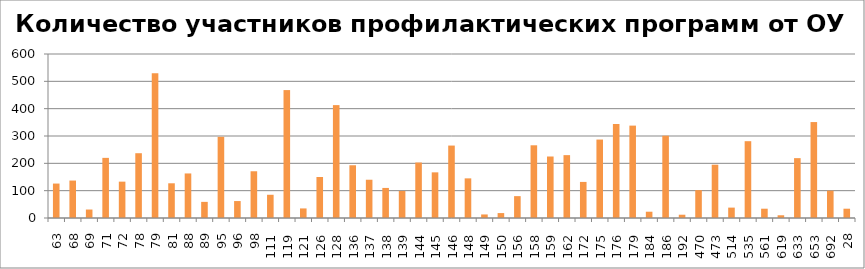
| Category | Количество участников профилактических программ от ОУ |
|---|---|
| 63.0 | 126 |
| 68.0 | 137 |
| 69.0 | 31 |
| 71.0 | 220 |
| 72.0 | 133 |
| 78.0 | 237 |
| 79.0 | 530 |
| 81.0 | 127 |
| 88.0 | 163 |
| 89.0 | 59 |
| 95.0 | 297 |
| 96.0 | 62 |
| 98.0 | 171 |
| 111.0 | 85 |
| 119.0 | 468 |
| 121.0 | 35 |
| 126.0 | 150 |
| 128.0 | 413 |
| 136.0 | 193 |
| 137.0 | 140 |
| 138.0 | 110 |
| 139.0 | 99 |
| 144.0 | 203 |
| 145.0 | 167 |
| 146.0 | 265 |
| 148.0 | 145 |
| 149.0 | 13 |
| 150.0 | 18 |
| 156.0 | 80 |
| 158.0 | 266 |
| 159.0 | 225 |
| 162.0 | 230 |
| 172.0 | 132 |
| 175.0 | 287 |
| 176.0 | 344 |
| 179.0 | 338 |
| 184.0 | 23 |
| 186.0 | 301 |
| 192.0 | 12 |
| 470.0 | 102 |
| 473.0 | 195 |
| 514.0 | 38 |
| 535.0 | 281 |
| 561.0 | 34 |
| 619.0 | 10 |
| 633.0 | 219 |
| 653.0 | 351 |
| 692.0 | 100 |
| 28.0 | 34 |